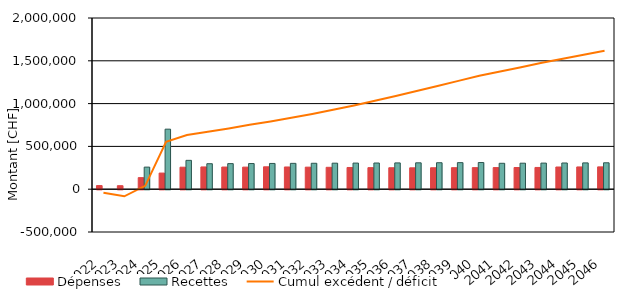
| Category | Dépenses | Recettes |
|---|---|---|
| 2022.0 | 42400 | 0 |
| 2023.0 | 40907.333 | 0 |
| 2024.0 | 135165.746 | 258000.638 |
| 2025.0 | 188406.641 | 701395.176 |
| 2026.0 | 257051.653 | 337084.935 |
| 2027.0 | 260024.015 | 297856.034 |
| 2028.0 | 258966.877 | 298846.839 |
| 2029.0 | 257915.974 | 299847.74 |
| 2030.0 | 261671.366 | 300858.839 |
| 2031.0 | 259673.118 | 301880.238 |
| 2032.0 | 257681.292 | 302912.039 |
| 2033.0 | 255695.953 | 303954.348 |
| 2034.0 | 253717.166 | 305007.268 |
| 2035.0 | 251744.996 | 306070.905 |
| 2036.0 | 250739.51 | 307145.368 |
| 2037.0 | 249740.774 | 308230.764 |
| 2038.0 | 250415.522 | 309327.203 |
| 2039.0 | 251311.782 | 310434.795 |
| 2040.0 | 252000.371 | 311553.651 |
| 2041.0 | 252695.984 | 302683.884 |
| 2042.0 | 253398.692 | 303825.608 |
| 2043.0 | 254108.566 | 304978.938 |
| 2044.0 | 259229.477 | 306143.99 |
| 2045.0 | 259953.897 | 307320.881 |
| 2046.0 | 260685.699 | 308509.729 |